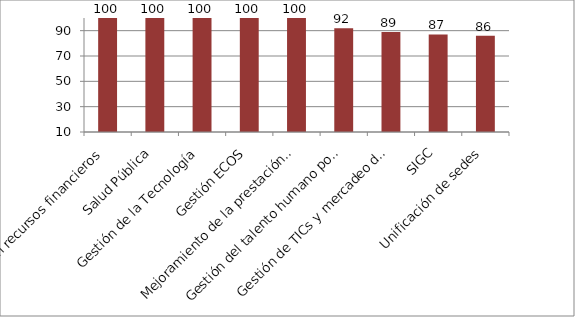
| Category | Series 0 |
|---|---|
| Gestión recursos financieros | 100 |
| Salud Pública | 100 |
| Gestión de la Tecnología | 100 |
| Gestión ECOS | 100 |
| Mejoramiento de la prestación de servicios de salud | 100 |
| Gestión del talento humano por competencias | 92 |
| Gestión de TICs y mercadeo de servicios | 89 |
| SIGC | 87 |
| Unificación de sedes | 86 |